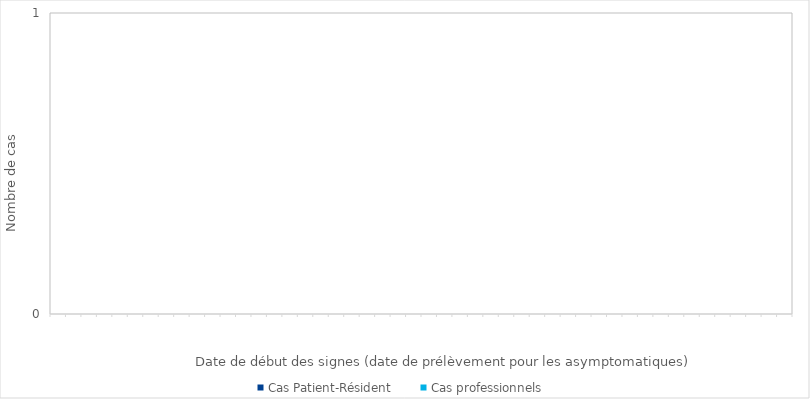
| Category | Cas Patient-Résident | Cas professionnels |
|---|---|---|
| 0 | 0 | 0 |
| 1900-01-01 | 0 | 0 |
| 1900-01-02 | 0 | 0 |
| 1900-01-03 | 0 | 0 |
| 1900-01-04 | 0 | 0 |
| 1900-01-05 | 0 | 0 |
| 1900-01-06 | 0 | 0 |
| 1900-01-07 | 0 | 0 |
| 1900-01-08 | 0 | 0 |
| 1900-01-09 | 0 | 0 |
| 1900-01-10 | 0 | 0 |
| 1900-01-11 | 0 | 0 |
| 1900-01-12 | 0 | 0 |
| 1900-01-13 | 0 | 0 |
| 1900-01-14 | 0 | 0 |
| 1900-01-15 | 0 | 0 |
| 1900-01-16 | 0 | 0 |
| 1900-01-17 | 0 | 0 |
| 1900-01-18 | 0 | 0 |
| 1900-01-19 | 0 | 0 |
| 1900-01-20 | 0 | 0 |
| 1900-01-21 | 0 | 0 |
| 1900-01-22 | 0 | 0 |
| 1900-01-23 | 0 | 0 |
| 1900-01-24 | 0 | 0 |
| 1900-01-25 | 0 | 0 |
| 1900-01-26 | 0 | 0 |
| 1900-01-27 | 0 | 0 |
| 1900-01-28 | 0 | 0 |
| 1900-01-29 | 0 | 0 |
| 1900-01-30 | 0 | 0 |
| 1900-01-31 | 0 | 0 |
| 1900-02-01 | 0 | 0 |
| 1900-02-02 | 0 | 0 |
| 1900-02-03 | 0 | 0 |
| 1900-02-04 | 0 | 0 |
| 1900-02-05 | 0 | 0 |
| 1900-02-06 | 0 | 0 |
| 1900-02-07 | 0 | 0 |
| 1900-02-08 | 0 | 0 |
| 1900-02-09 | 0 | 0 |
| 1900-02-10 | 0 | 0 |
| 1900-02-11 | 0 | 0 |
| 1900-02-12 | 0 | 0 |
| 1900-02-13 | 0 | 0 |
| 1900-02-14 | 0 | 0 |
| 1900-02-15 | 0 | 0 |
| 1900-02-16 | 0 | 0 |